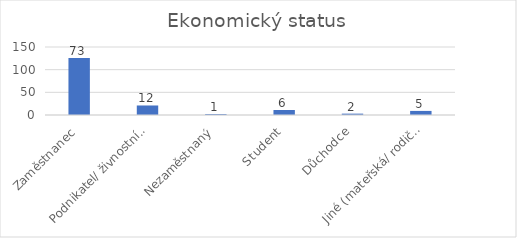
| Category | Počet respondentů |
|---|---|
| Zaměstnanec | 126 |
| Podnikatel/ živnostník/ OSVČ | 21 |
| Nezaměstnaný | 2 |
| Student | 11 |
| Důchodce | 3 |
| Jiné (mateřská/ rodičovská dovolená, trvalá nemocenská apod.) | 9 |